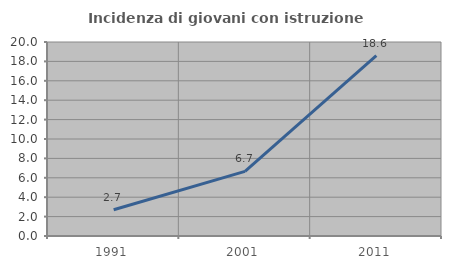
| Category | Incidenza di giovani con istruzione universitaria |
|---|---|
| 1991.0 | 2.703 |
| 2001.0 | 6.667 |
| 2011.0 | 18.605 |